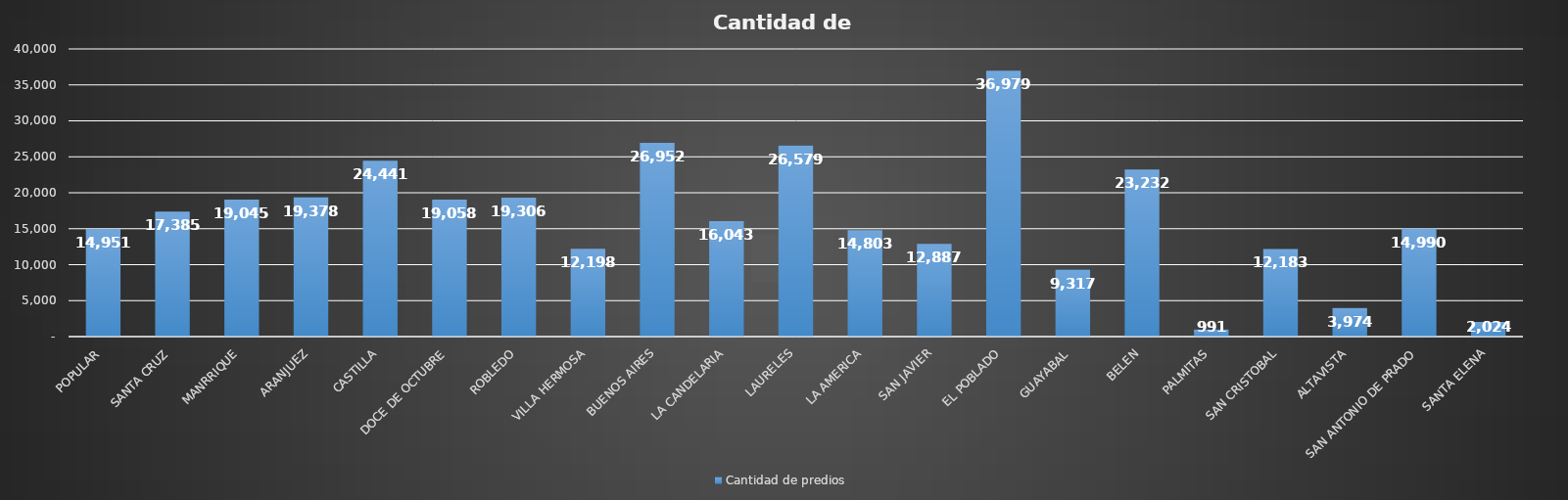
| Category | Cantidad de predios  |
|---|---|
| POPULAR | 14951 |
| SANTA CRUZ | 17385 |
| MANRRIQUE | 19045 |
| ARANJUEZ | 19378 |
| CASTILLA | 24441 |
| DOCE DE OCTUBRE | 19058 |
| ROBLEDO | 19306 |
| VILLA HERMOSA | 12198 |
| BUENOS AIRES | 26952 |
| LA CANDELARIA | 16043 |
| LAURELES | 26579 |
| LA AMERICA | 14803 |
| SAN JAVIER | 12887 |
| EL POBLADO | 36979 |
| GUAYABAL | 9317 |
| BELEN | 23232 |
| PALMITAS | 991 |
| SAN CRISTOBAL | 12183 |
| ALTAVISTA | 3974 |
| SAN ANTONIO DE PRADO | 14990 |
| SANTA ELENA | 2024 |